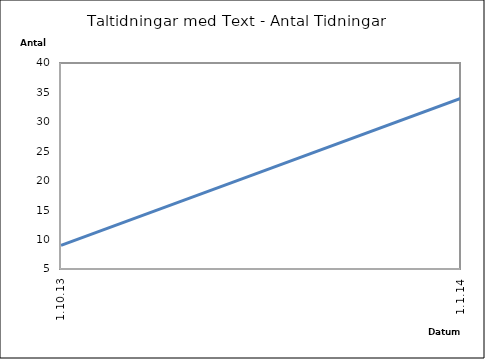
| Category | Series 0 |
|---|---|
| 1.10.13 | 9 |
| 1.1.14 | 34 |